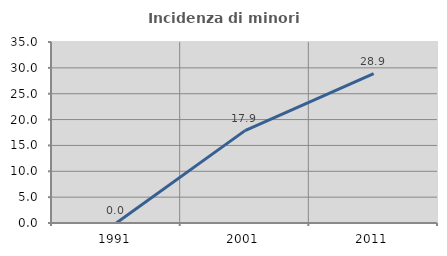
| Category | Incidenza di minori stranieri |
|---|---|
| 1991.0 | 0 |
| 2001.0 | 17.857 |
| 2011.0 | 28.866 |